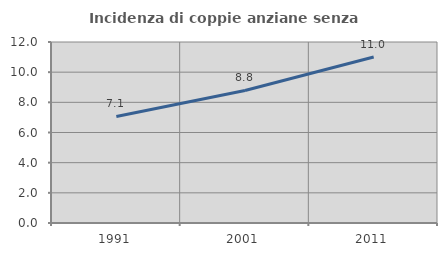
| Category | Incidenza di coppie anziane senza figli  |
|---|---|
| 1991.0 | 7.061 |
| 2001.0 | 8.789 |
| 2011.0 | 11.002 |